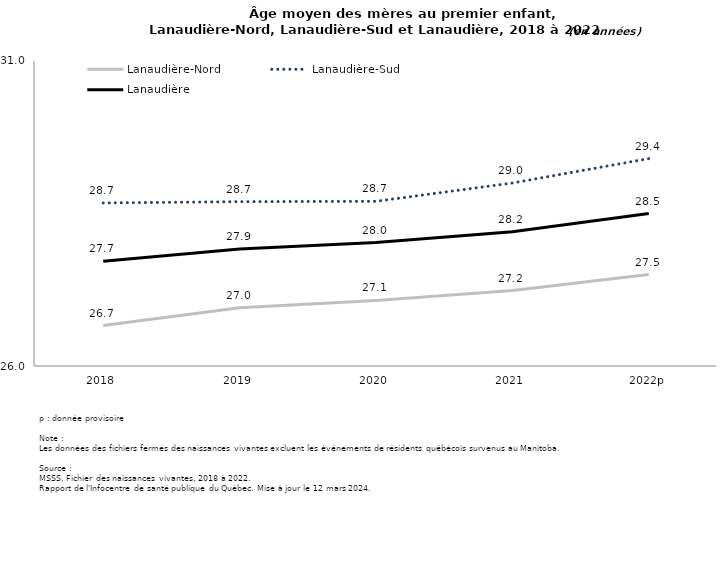
| Category | Lanaudière-Nord | Lanaudière-Sud | Lanaudière |
|---|---|---|---|
| 2018 | 26.663 | 28.673 | 27.719 |
| 2019 | 26.957 | 28.694 | 27.917 |
| 2020 | 27.075 | 28.7 | 28.023 |
| 2021 | 27.237 | 29 | 28.2 |
| 2022p | 27.5 | 29.4 | 28.5 |